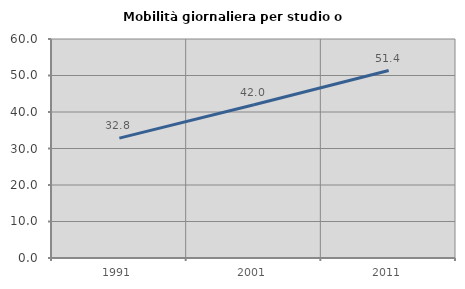
| Category | Mobilità giornaliera per studio o lavoro |
|---|---|
| 1991.0 | 32.842 |
| 2001.0 | 41.967 |
| 2011.0 | 51.367 |